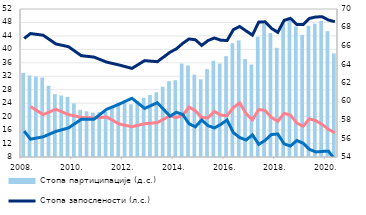
| Category | Стопа партиципације (д.с.) |
|---|---|
| 2008. | 63.1 |
| II | 62.8 |
| III | 62.7 |
| IV | 62.6 |
| 2009. | 61.7 |
| II | 60.8 |
| III | 60.65 |
| IV | 60.5 |
| 2010. | 59.8 |
| II | 59.1 |
| III | 58.95 |
| IV | 58.8 |
| 2011. | 58.85 |
| II | 58.9 |
| III | 59.4 |
| IV | 59.9 |
| 2012. | 59.8 |
| II | 59.7 |
| III | 60.05 |
| IV | 60.4 |
| 2013. | 60.7 |
| II | 61 |
| III | 61.6 |
| IV | 62.2 |
| 2014. | 62.3 |
| II | 64.1 |
| III | 63.9 |
| IV | 62.9 |
| 2015. | 62.4 |
| II | 63.5 |
| III | 64.4 |
| IV | 64.1 |
| 2016. | 64.9 |
| II | 66.3 |
| III | 66.6 |
| IV | 64.6 |
| 2017. | 64 |
| II | 67 |
| III | 68.4 |
| IV | 67.4 |
| 2018. | 65.8 |
| II | 68.5 |
| III | 69 |
| IV | 68.1 |
| 2019. | 67.2 |
| II | 68.2 |
| III | 68.4 |
| IV | 68.7 |
| 2020. | 67.6 |
| II | 65.2 |